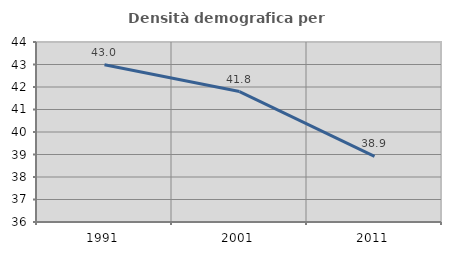
| Category | Densità demografica |
|---|---|
| 1991.0 | 42.991 |
| 2001.0 | 41.798 |
| 2011.0 | 38.919 |